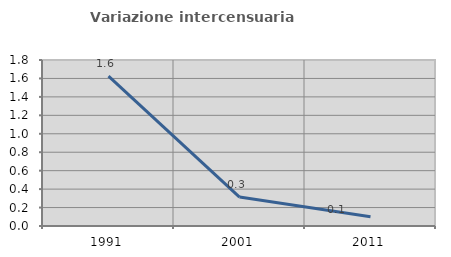
| Category | Variazione intercensuaria annua |
|---|---|
| 1991.0 | 1.624 |
| 2001.0 | 0.314 |
| 2011.0 | 0.101 |